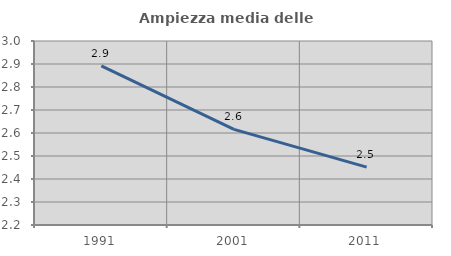
| Category | Ampiezza media delle famiglie |
|---|---|
| 1991.0 | 2.892 |
| 2001.0 | 2.616 |
| 2011.0 | 2.452 |